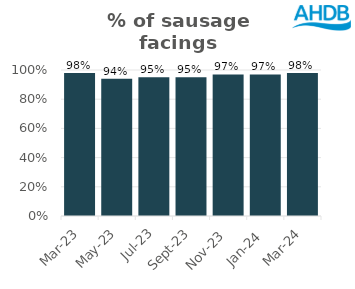
| Category | Sausage |
|---|---|
| 2023-03-01 | 0.98 |
| 2023-05-01 | 0.94 |
| 2023-07-01 | 0.95 |
| 2023-09-01 | 0.95 |
| 2023-11-01 | 0.97 |
| 2024-01-01 | 0.97 |
| 2024-03-01 | 0.98 |